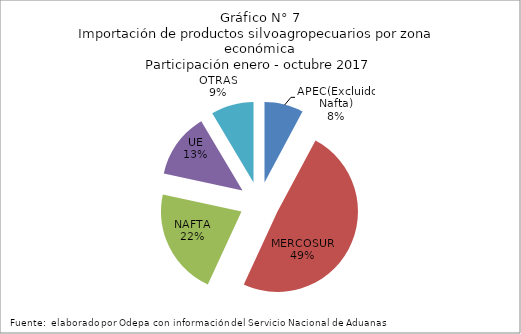
| Category | Series 0 |
|---|---|
| APEC(Excluido Nafta) | 375358.471 |
| MERCOSUR | 2353485.139 |
| NAFTA | 1031657.872 |
| UE | 626721.526 |
| OTRAS | 410777.992 |